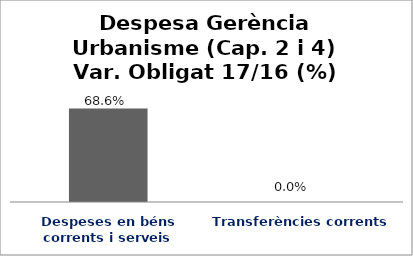
| Category | Series 0 |
|---|---|
| Despeses en béns corrents i serveis | 0.686 |
| Transferències corrents | 0 |